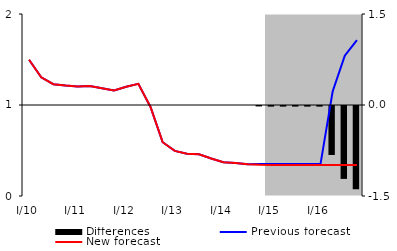
| Category | Differences |
|---|---|
| 0 | 0 |
| 1 | 0 |
| 2 | 0 |
| 3 | 0 |
| 4 | 0 |
| 5 | 0 |
| 6 | 0 |
| 7 | 0 |
| 8 | 0 |
| 9 | 0 |
| 10 | 0 |
| 11 | 0 |
| 12 | 0 |
| 13 | 0 |
| 14 | 0 |
| 15 | 0 |
| 16 | 0 |
| 17 | 0 |
| 18 | 0 |
| 19 | -0.007 |
| 20 | -0.01 |
| 21 | -0.01 |
| 22 | -0.01 |
| 23 | -0.01 |
| 24 | -0.01 |
| 25 | -0.807 |
| 26 | -1.202 |
| 27 | -1.372 |